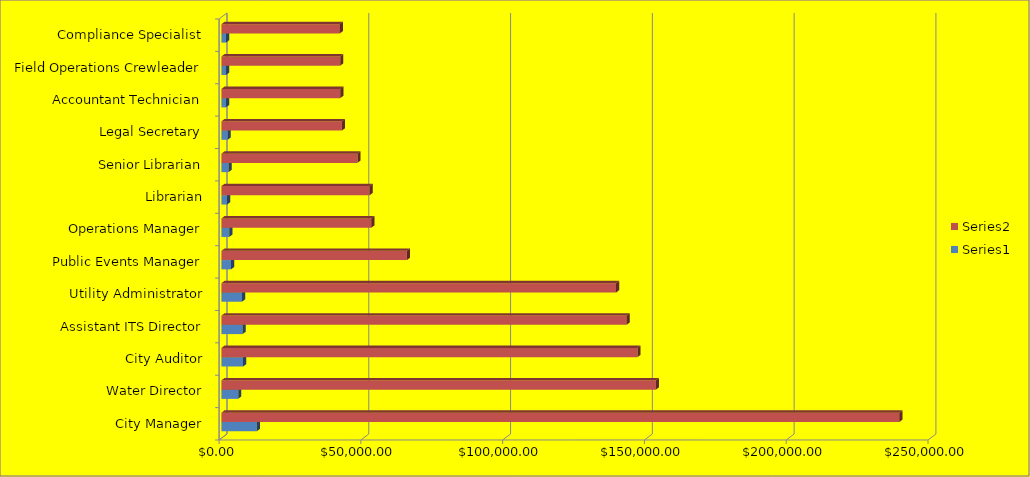
| Category | Series 0 | Series 1 |
|---|---|---|
| City Manager | 12462.725 | 239057.725 |
| Water Director | 5893.88 | 153240.88 |
| City Auditor | 7647.64 | 146695.64 |
| Assistant ITS Director | 7448.595 | 142877.595 |
| Utility Administrator | 7256.37 | 139190.37 |
| Public Events Manager | 3410.44 | 65418.44 |
| Operations Manager | 2755.885 | 52862.885 |
| Librarian | 2009.28 | 52241.28 |
| Senior Librarian | 2499.64 | 47947.64 |
| Legal Secretary | 2215.95 | 42505.95 |
| Accountant Technician | 1611.6 | 41901.6 |
| Field Operations Crewleader | 1610.76 | 41879.76 |
| Compliance Specialist | 1606.6 | 41771.6 |